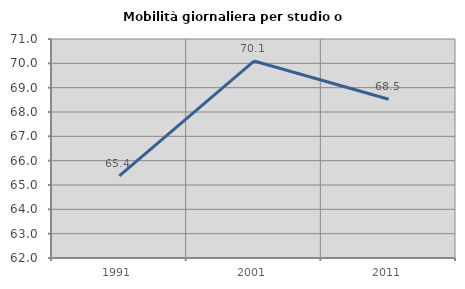
| Category | Mobilità giornaliera per studio o lavoro |
|---|---|
| 1991.0 | 65.372 |
| 2001.0 | 70.093 |
| 2011.0 | 68.521 |